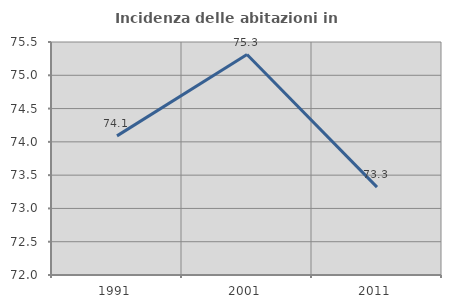
| Category | Incidenza delle abitazioni in proprietà  |
|---|---|
| 1991.0 | 74.09 |
| 2001.0 | 75.311 |
| 2011.0 | 73.32 |